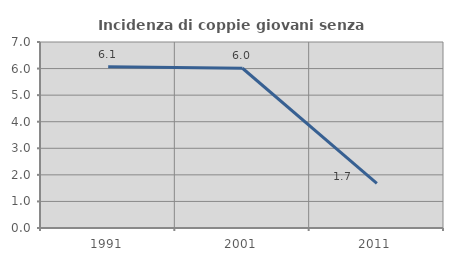
| Category | Incidenza di coppie giovani senza figli |
|---|---|
| 1991.0 | 6.067 |
| 2001.0 | 6.012 |
| 2011.0 | 1.677 |